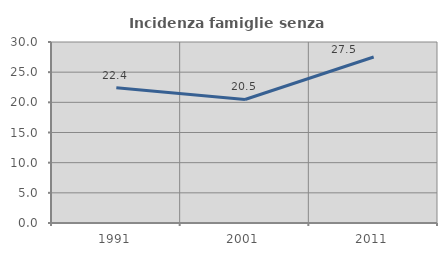
| Category | Incidenza famiglie senza nuclei |
|---|---|
| 1991.0 | 22.404 |
| 2001.0 | 20.47 |
| 2011.0 | 27.52 |